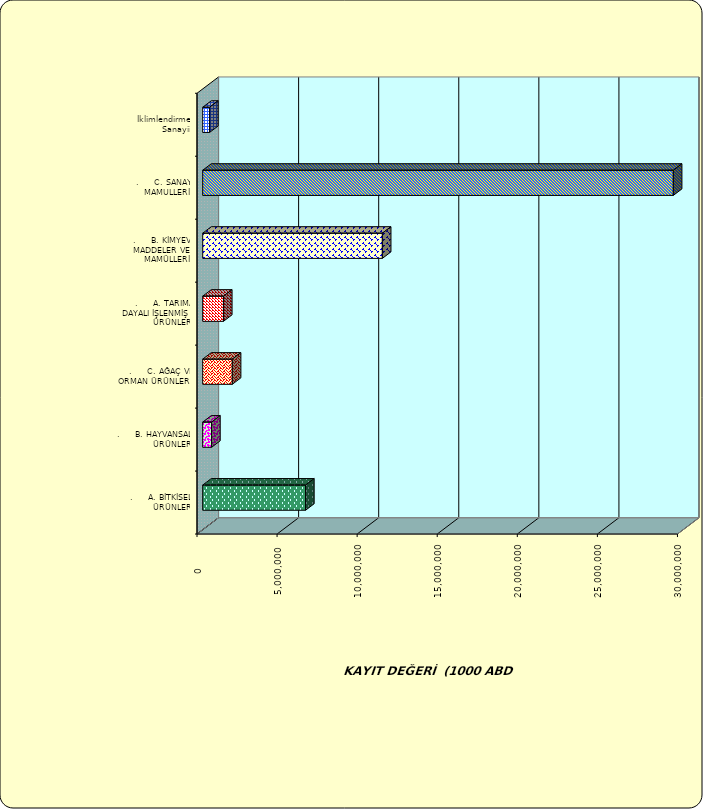
| Category | Series 0 |
|---|---|
| .     A. BİTKİSEL ÜRÜNLER | 6423045.331 |
| .     B. HAYVANSAL ÜRÜNLER | 556968.084 |
| .     C. AĞAÇ VE ORMAN ÜRÜNLERİ | 1847520.231 |
| .     A. TARIMA DAYALI İŞLENMİŞ ÜRÜNLER | 1295949.921 |
| .     B. KİMYEVİ MADDELER VE MAMÜLLERİ | 11218545.684 |
| .     C. SANAYİ MAMULLERİ | 29385546.197 |
|  İklimlendirme Sanayii | 430157.14 |